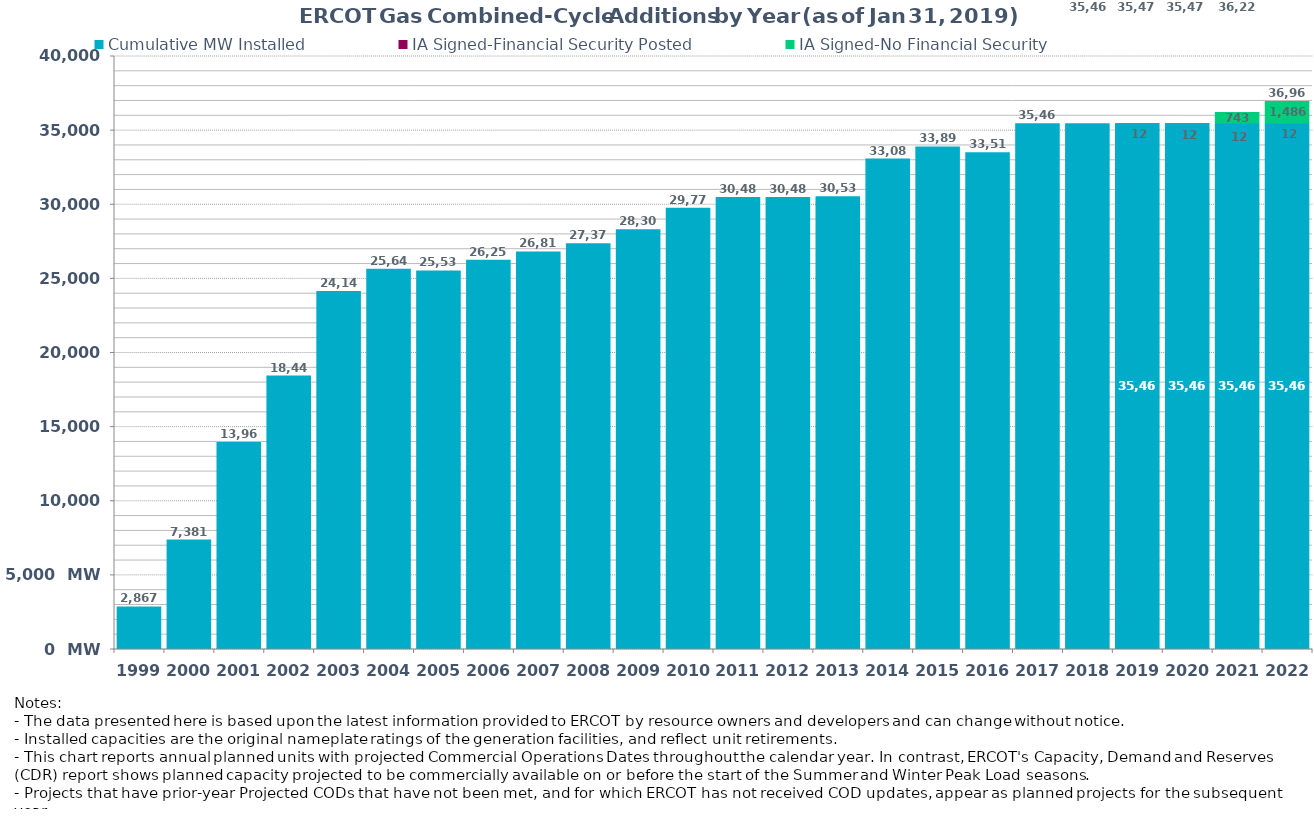
| Category | Cumulative MW Installed | IA Signed-Financial Security Posted  | IA Signed-No Financial Security  | Cumulative Installed and Planned |
|---|---|---|---|---|
| 1999.0 | 2867 | 0 | 0 | 2867 |
| 2000.0 | 7381 | 0 | 0 | 7381 |
| 2001.0 | 13967 | 0 | 0 | 13967 |
| 2002.0 | 18443 | 0 | 0 | 18443 |
| 2003.0 | 24141 | 0 | 0 | 24141 |
| 2004.0 | 25641 | 0 | 0 | 25641 |
| 2005.0 | 25539 | 0 | 0 | 25539 |
| 2006.0 | 26258 | 0 | 0 | 26258 |
| 2007.0 | 26815 | 0 | 0 | 26815 |
| 2008.0 | 27376 | 0 | 0 | 27376 |
| 2009.0 | 28309 | 0 | 0 | 28309 |
| 2010.0 | 29770 | 0 | 0 | 29770 |
| 2011.0 | 30488 | 0 | 0 | 30488 |
| 2012.0 | 30488 | 0 | 0 | 30488 |
| 2013.0 | 30538 | 0 | 0 | 30538 |
| 2014.0 | 33080 | 0 | 0 | 33080 |
| 2015.0 | 33897 | 0 | 0 | 33897 |
| 2016.0 | 33515 | 0 | 0 | 33515 |
| 2017.0 | 35465 | 0 | 0 | 35465 |
| 2018.0 | 35465 | 0 | 0 | 35465 |
| 2019.0 | 35465 | 12 | 0 | 35477 |
| 2020.0 | 35465 | 12 | 0 | 35477 |
| 2021.0 | 35465 | 12 | 742.9 | 36219.9 |
| 2022.0 | 35465 | 12 | 1485.8 | 36962.8 |